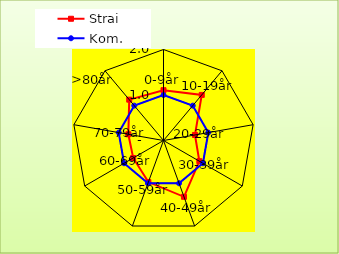
| Category | Strai | Kom. |
|---|---|---|
| 0-9år | 1.106 | 1 |
| 10-19år | 1.308 | 1 |
| 20-29år | 0.702 | 1 |
| 30-39år | 0.91 | 1 |
| 40-49år | 1.317 | 1 |
| 50-59år | 0.972 | 1 |
| 60-69år | 0.769 | 1 |
| 70-79år | 0.785 | 1 |
| >80år | 1.172 | 1 |